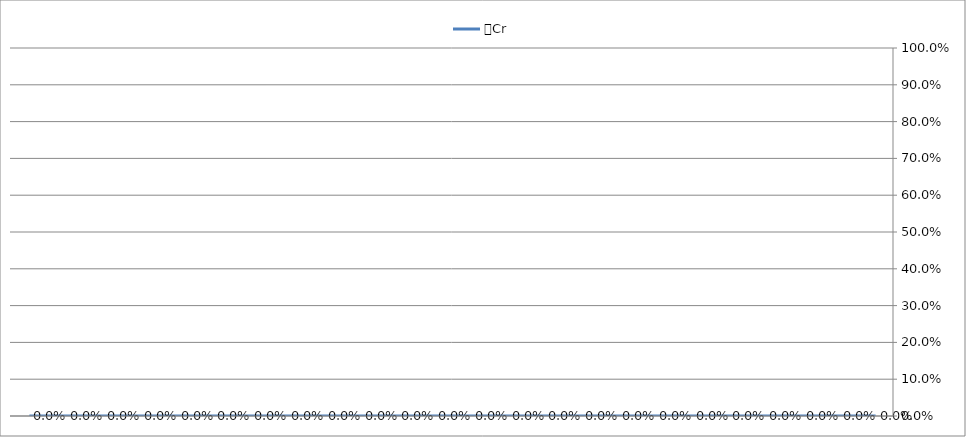
| Category | ％Cr |
|---|---|
|  | 0 |
|  | 0 |
|  | 0 |
|  | 0 |
|  | 0 |
|  | 0 |
|  | 0 |
|  | 0 |
|  | 0 |
|  | 0 |
|  | 0 |
|  | 0 |
|  | 0 |
|  | 0 |
|  | 0 |
|  | 0 |
|  | 0 |
|  | 0 |
|  | 0 |
|  | 0 |
|  | 0 |
|  | 0 |
|  | 0 |
|  | 0 |